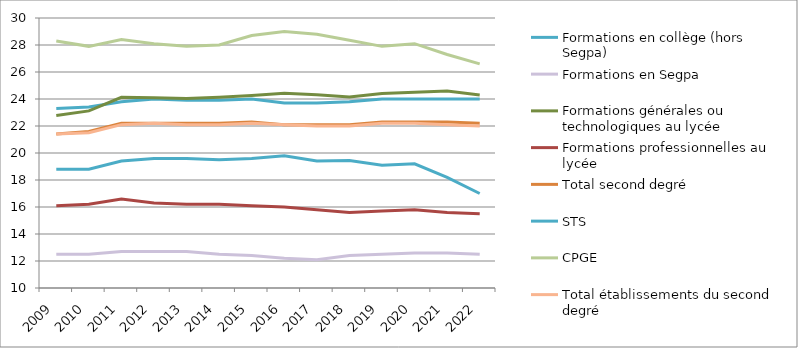
| Category | Formations en collège (hors Segpa) | Formations en Segpa | Formations générales ou technologiques au lycée | Formations professionnelles au lycée | Total second degré | STS | CPGE | Total établissements du second degré |
|---|---|---|---|---|---|---|---|---|
| 2009.0 | 23.3 | 12.5 | 22.78 | 16.1 | 21.4 | 18.8 | 28.3 | 21.4 |
| 2010.0 | 23.4 | 12.5 | 23.12 | 16.2 | 21.6 | 18.8 | 27.9 | 21.5 |
| 2011.0 | 23.8 | 12.7 | 24.13 | 16.6 | 22.2 | 19.4 | 28.4 | 22.1 |
| 2012.0 | 24 | 12.7 | 24.09 | 16.3 | 22.2 | 19.6 | 28.1 | 22.2 |
| 2013.0 | 23.9 | 12.7 | 24.04 | 16.2 | 22.2 | 19.6 | 27.9 | 22.1 |
| 2014.0 | 23.9 | 12.5 | 24.13 | 16.2 | 22.2 | 19.5 | 28 | 22.1 |
| 2015.0 | 24 | 12.4 | 24.26 | 16.1 | 22.3 | 19.6 | 28.7 | 22.2 |
| 2016.0 | 23.7 | 12.2 | 24.42 | 16 | 22.1 | 19.8 | 29 | 22.1 |
| 2017.0 | 23.7 | 12.1 | 24.31 | 15.8 | 22.1 | 19.4 | 28.8 | 22 |
| 2018.0 | 23.8 | 12.4 | 24.15 | 15.6 | 22.1 | 19.45 | 28.35 | 22 |
| 2019.0 | 24 | 12.5 | 24.4 | 15.7 | 22.3 | 19.1 | 27.9 | 22.2 |
| 2020.0 | 24 | 12.6 | 24.5 | 15.8 | 22.3 | 19.2 | 28.1 | 22.2 |
| 2021.0 | 24 | 12.6 | 24.6 | 15.6 | 22.3 | 18.2 | 27.3 | 22.1 |
| 2022.0 | 24 | 12.5 | 24.3 | 15.5 | 22.2 | 17 | 26.6 | 22 |